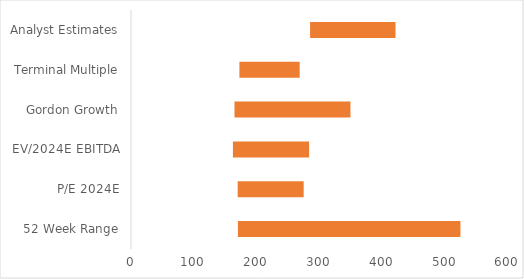
| Category | Series 0 | Series 1 |
|---|---|---|
| 52 Week Range | 170.17 | 354.14 |
| P/E 2024E | 169.792 | 105.026 |
| EV/2024E EBITDA | 162.213 | 121.225 |
| Gordon Growth | 164.722 | 184.56 |
| Terminal Multiple | 172.54 | 95.915 |
| Analyst Estimates | 285 | 136 |